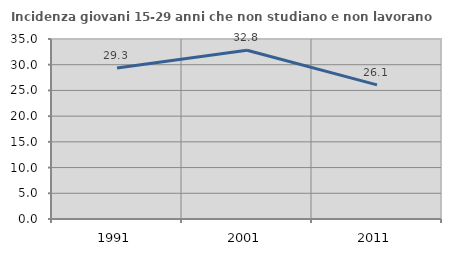
| Category | Incidenza giovani 15-29 anni che non studiano e non lavorano  |
|---|---|
| 1991.0 | 29.348 |
| 2001.0 | 32.824 |
| 2011.0 | 26.08 |